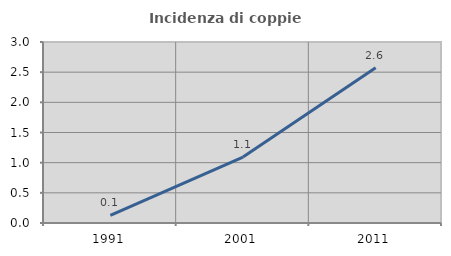
| Category | Incidenza di coppie miste |
|---|---|
| 1991.0 | 0.125 |
| 2001.0 | 1.093 |
| 2011.0 | 2.572 |